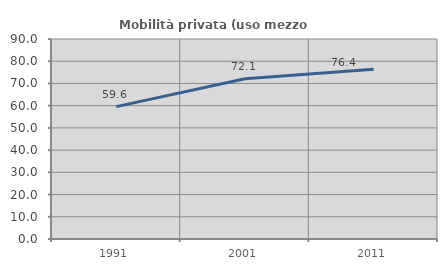
| Category | Mobilità privata (uso mezzo privato) |
|---|---|
| 1991.0 | 59.578 |
| 2001.0 | 72.129 |
| 2011.0 | 76.437 |